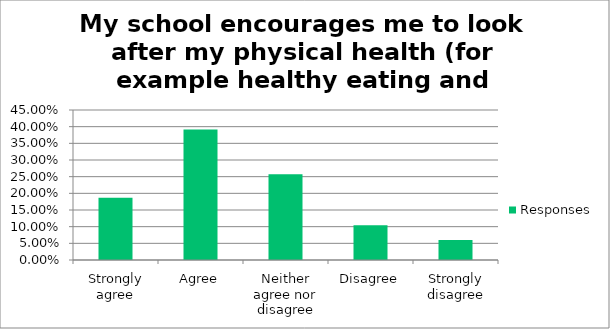
| Category | Responses |
|---|---|
| Strongly agree | 0.187 |
| Agree | 0.392 |
| Neither agree nor disagree | 0.258 |
| Disagree | 0.104 |
| Strongly disagree | 0.06 |